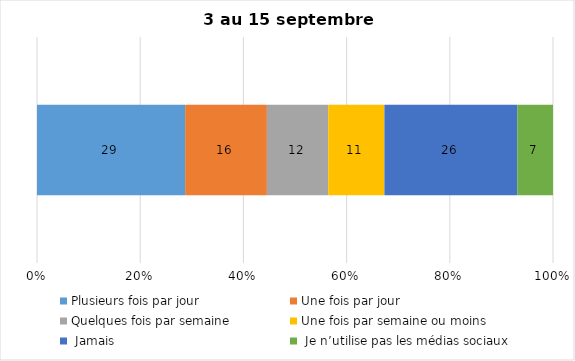
| Category | Plusieurs fois par jour | Une fois par jour | Quelques fois par semaine   | Une fois par semaine ou moins   |  Jamais   |  Je n’utilise pas les médias sociaux |
|---|---|---|---|---|---|---|
| 0 | 29 | 16 | 12 | 11 | 26 | 7 |